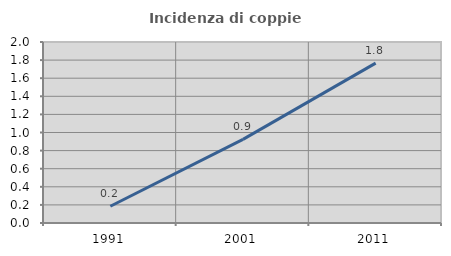
| Category | Incidenza di coppie miste |
|---|---|
| 1991.0 | 0.185 |
| 2001.0 | 0.924 |
| 2011.0 | 1.767 |